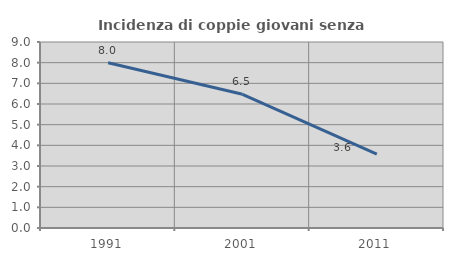
| Category | Incidenza di coppie giovani senza figli |
|---|---|
| 1991.0 | 7.996 |
| 2001.0 | 6.47 |
| 2011.0 | 3.574 |